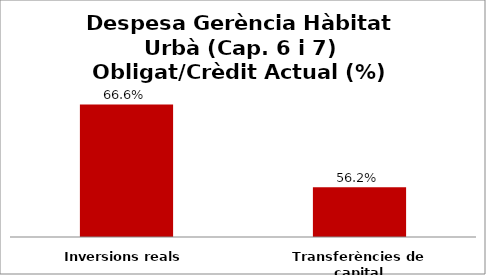
| Category | Series 0 |
|---|---|
| Inversions reals | 0.666 |
| Transferències de capital | 0.562 |